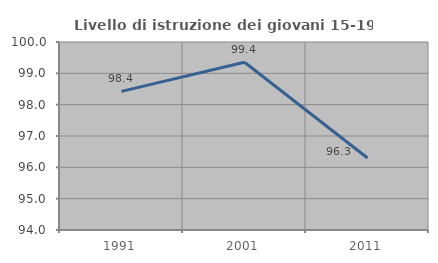
| Category | Livello di istruzione dei giovani 15-19 anni |
|---|---|
| 1991.0 | 98.425 |
| 2001.0 | 99.355 |
| 2011.0 | 96.296 |